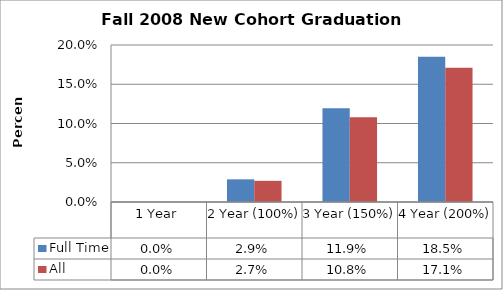
| Category | Full Time | All  |
|---|---|---|
| 1 Year | 0 | 0 |
| 2 Year (100%) | 0.029 | 0.027 |
| 3 Year (150%) | 0.119 | 0.108 |
| 4 Year (200%) | 0.185 | 0.171 |